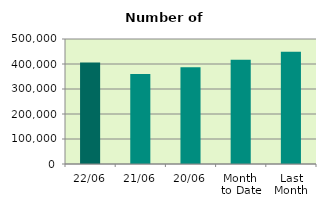
| Category | Series 0 |
|---|---|
| 22/06 | 406382 |
| 21/06 | 359612 |
| 20/06 | 386962 |
| Month 
to Date | 417366.75 |
| Last
Month | 449234.545 |